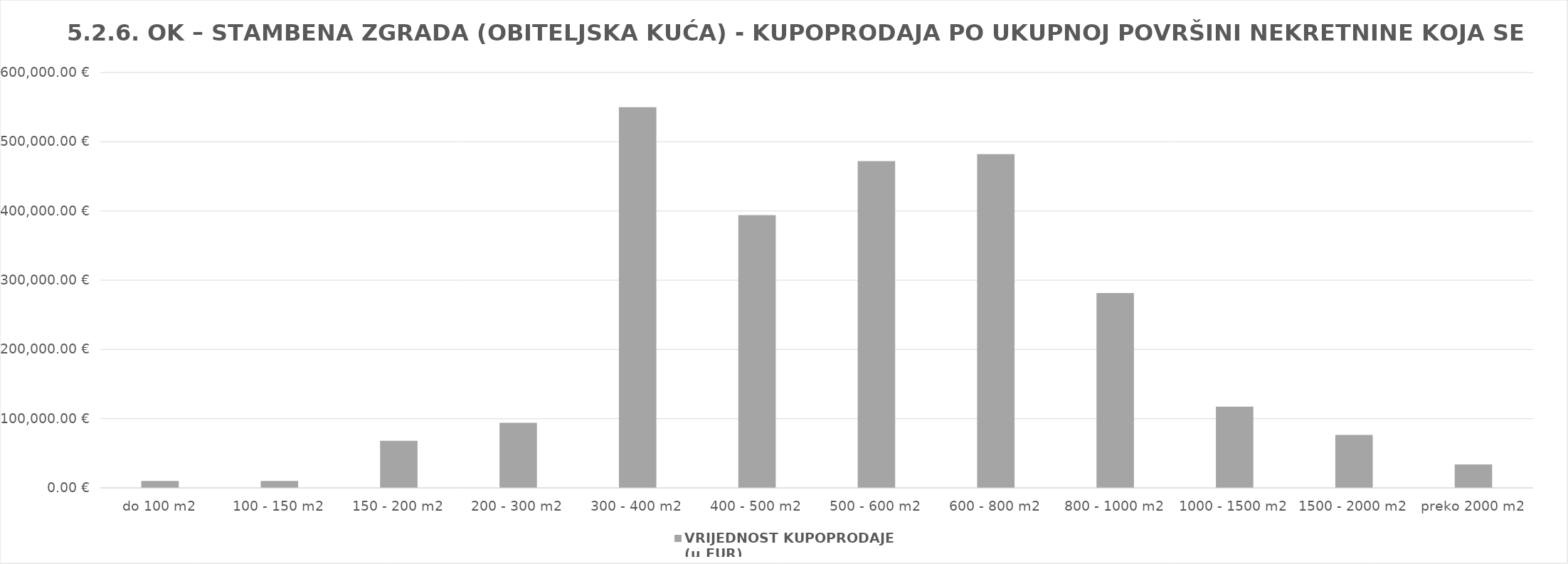
| Category | VRIJEDNOST KUPOPRODAJE   
(u EUR) |
|---|---|
| do 100 m2 | 10000 |
| 100 - 150 m2 | 10000 |
| 150 - 200 m2 | 68000 |
| 200 - 300 m2 | 94000 |
| 300 - 400 m2 | 550000 |
| 400 - 500 m2 | 394000 |
| 500 - 600 m2 | 472000 |
| 600 - 800 m2 | 482000 |
| 800 - 1000 m2 | 281500 |
| 1000 - 1500 m2 | 117500 |
| 1500 - 2000 m2 | 76600 |
| preko 2000 m2 | 34000 |